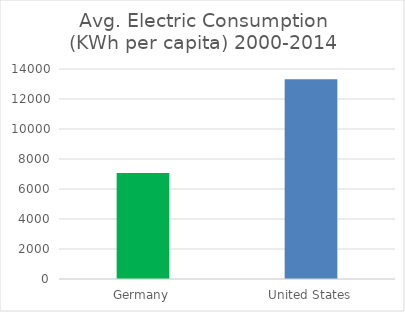
| Category | Average 2000-2014 |
|---|---|
| Germany | 7071.398 |
| United States | 13322.355 |